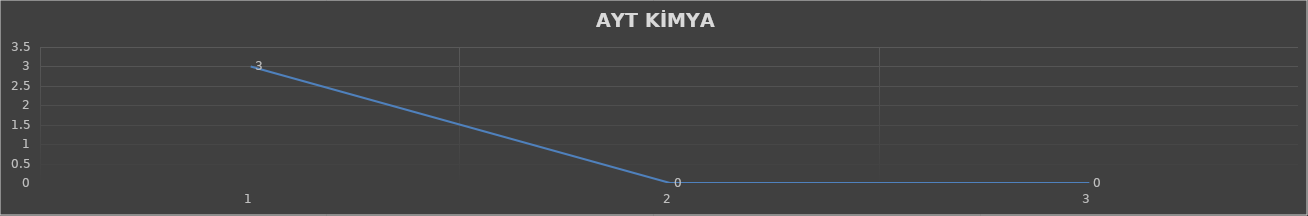
| Category | Series 0 |
|---|---|
| 0 | 3 |
| 1 | 0 |
| 2 | 0 |